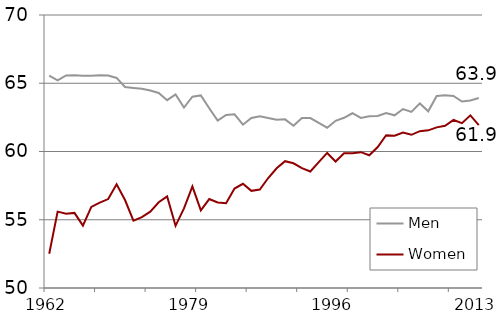
| Category | Men | Women |
|---|---|---|
| 1962.0 | 65.559 | 52.506 |
| 1963.0 | 65.213 | 55.597 |
| 1964.0 | 65.576 | 55.448 |
| 1965.0 | 65.589 | 55.501 |
| 1966.0 | 65.557 | 54.569 |
| 1967.0 | 65.559 | 55.939 |
| 1968.0 | 65.582 | 56.253 |
| 1969.0 | 65.568 | 56.517 |
| 1970.0 | 65.389 | 57.598 |
| 1971.0 | 64.724 | 56.444 |
| 1972.0 | 64.656 | 54.94 |
| 1973.0 | 64.593 | 55.195 |
| 1974.0 | 64.467 | 55.589 |
| 1975.0 | 64.287 | 56.278 |
| 1976.0 | 63.763 | 56.711 |
| 1977.0 | 64.176 | 54.554 |
| 1978.0 | 63.223 | 55.828 |
| 1979.0 | 64.011 | 57.444 |
| 1980.0 | 64.111 | 55.685 |
| 1981.0 | 63.169 | 56.517 |
| 1982.0 | 62.27 | 56.267 |
| 1983.0 | 62.676 | 56.206 |
| 1984.0 | 62.729 | 57.287 |
| 1985.0 | 61.964 | 57.632 |
| 1986.0 | 62.453 | 57.116 |
| 1987.0 | 62.585 | 57.21 |
| 1988.0 | 62.447 | 58.058 |
| 1989.0 | 62.328 | 58.77 |
| 1990.0 | 62.354 | 59.291 |
| 1991.0 | 61.884 | 59.137 |
| 1992.0 | 62.461 | 58.786 |
| 1993.0 | 62.447 | 58.538 |
| 1994.0 | 62.095 | 59.216 |
| 1995.0 | 61.744 | 59.894 |
| 1996.0 | 62.249 | 59.265 |
| 1997.0 | 62.468 | 59.867 |
| 1998.0 | 62.802 | 59.872 |
| 1999.0 | 62.455 | 59.95 |
| 2000.0 | 62.577 | 59.721 |
| 2001.0 | 62.597 | 60.325 |
| 2002.0 | 62.825 | 61.19 |
| 2003.0 | 62.651 | 61.161 |
| 2004.0 | 63.112 | 61.385 |
| 2005.0 | 62.896 | 61.224 |
| 2006.0 | 63.524 | 61.487 |
| 2007.0 | 62.942 | 61.548 |
| 2008.0 | 64.063 | 61.767 |
| 2009.0 | 64.129 | 61.88 |
| 2010.0 | 64.074 | 62.308 |
| 2011.0 | 63.66 | 62.077 |
| 2012.0 | 63.743 | 62.65 |
| 2013.0 | 63.921 | 61.929 |